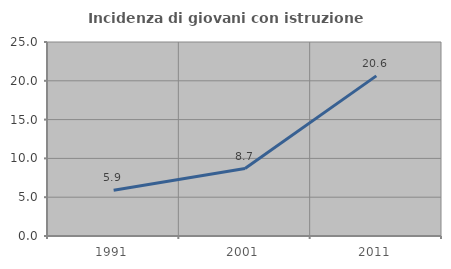
| Category | Incidenza di giovani con istruzione universitaria |
|---|---|
| 1991.0 | 5.882 |
| 2001.0 | 8.696 |
| 2011.0 | 20.635 |